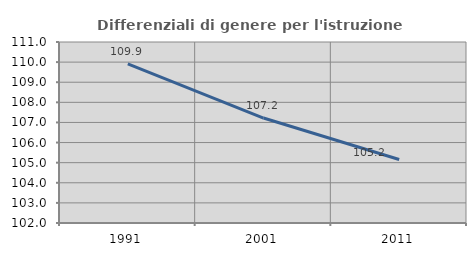
| Category | Differenziali di genere per l'istruzione superiore |
|---|---|
| 1991.0 | 109.915 |
| 2001.0 | 107.218 |
| 2011.0 | 105.159 |